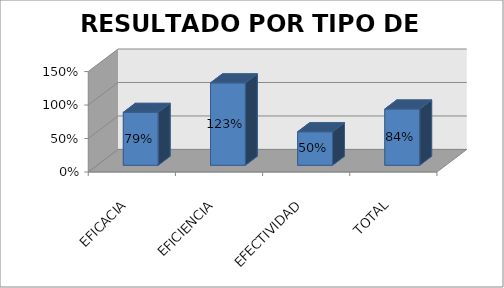
| Category | PROMEDIO  |
|---|---|
| EFICACIA | 0.79 |
| EFICIENCIA | 1.23 |
| EFECTIVIDAD  | 0.5 |
| TOTAL  | 0.84 |